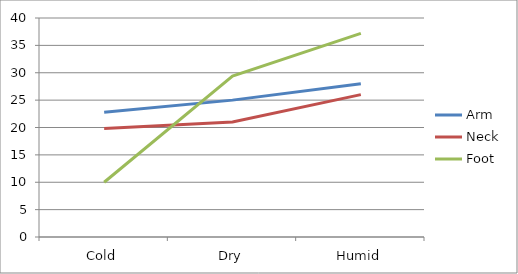
| Category | Arm | Neck | Foot |
|---|---|---|---|
| Cold | 22.8 | 19.8 | 10 |
| Dry | 25 | 21 | 29.4 |
| Humid | 28 | 26 | 37.2 |